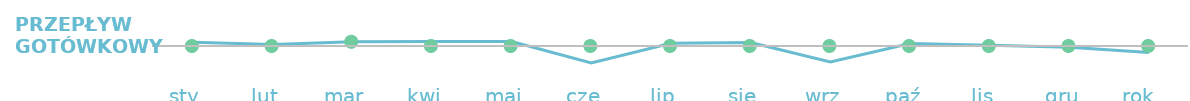
| Category | Przepływ gotówkowy |
|---|---|
| sty  | 169 |
| lut  | 69 |
| mar  | 192 |
| kwi  | 199 |
| maj  | 204 |
| cze  | -771 |
| lip  | 124 |
| sie  | 154 |
| wrz  | -721 |
| paź  | 109 |
| lis  | 34 |
| gru  | -61 |
| rok   | -299 |